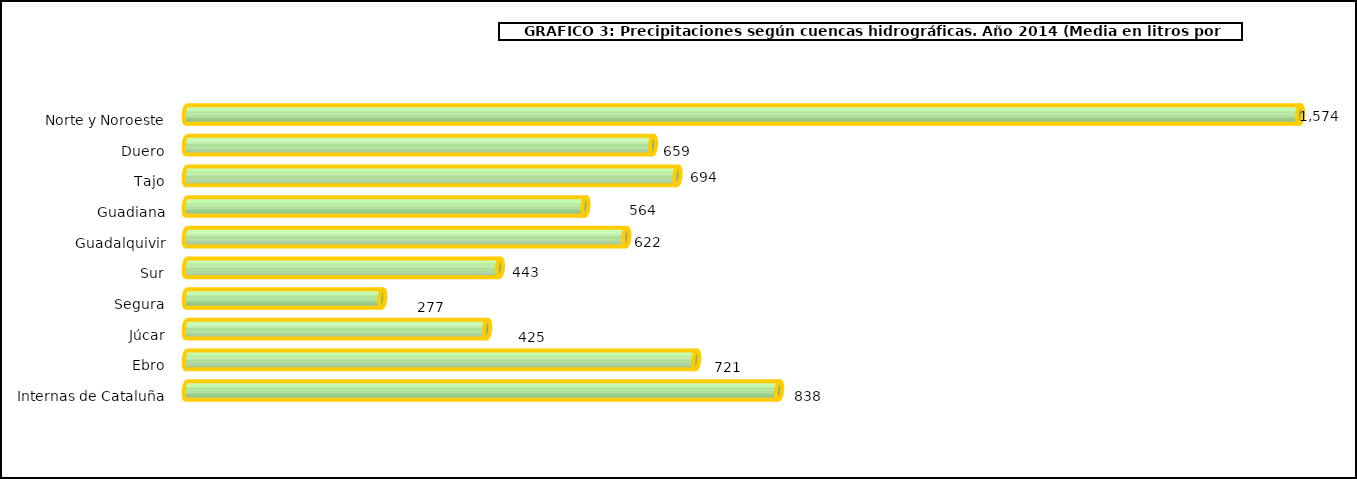
| Category | cuencas |
|---|---|
| 0 | 1574.1 |
| 1 | 659.3 |
| 2 | 694 |
| 3 | 563.8 |
| 4 | 621.6 |
| 5 | 442.8 |
| 6 | 276.5 |
| 7 | 424.8 |
| 8 | 720.5 |
| 9 | 837.6 |